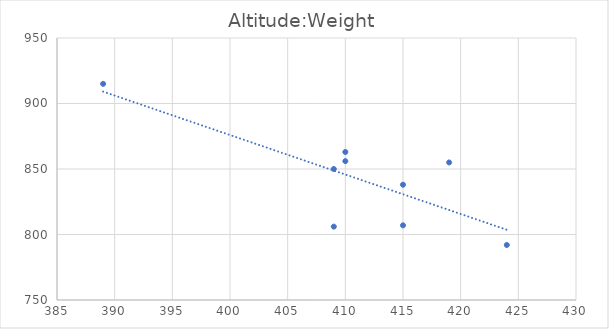
| Category | Altitude:Weight |
|---|---|
| 424.0 | 792 |
| 409.0 | 850 |
| 389.0 | 915 |
| 410.0 | 863 |
| 415.0 | 838 |
| 410.0 | 856 |
| 415.0 | 807 |
| 409.0 | 806 |
| 419.0 | 855 |